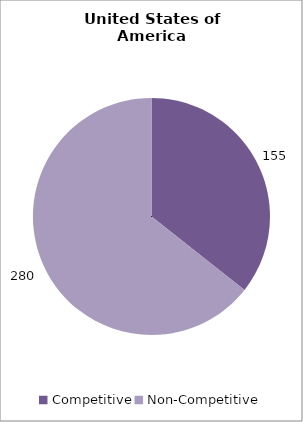
| Category | Series 0 |
|---|---|
| 0 | 155 |
| 1 | 280 |